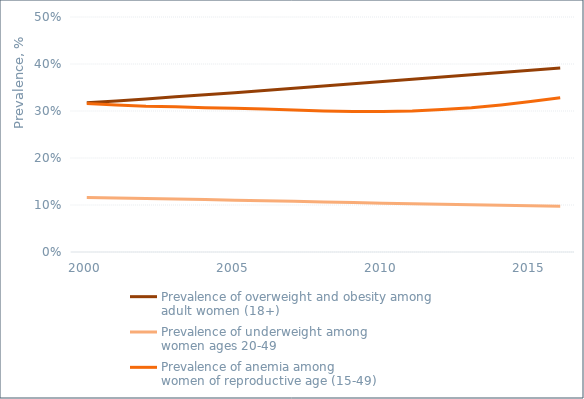
| Category | Prevalence of overweight and obesity among 
adult women (18+) | Prevalence of underweight among 
women ages 20-49 | Prevalence of anemia among 
women of reproductive age (15-49) |
|---|---|---|---|
| 2000.0 | 0.317 | 0.116 | 0.316 |
| 2001.0 | 0.322 | 0.115 | 0.313 |
| 2002.0 | 0.326 | 0.114 | 0.31 |
| 2003.0 | 0.33 | 0.113 | 0.309 |
| 2004.0 | 0.335 | 0.111 | 0.307 |
| 2005.0 | 0.339 | 0.11 | 0.306 |
| 2006.0 | 0.344 | 0.109 | 0.304 |
| 2007.0 | 0.348 | 0.108 | 0.302 |
| 2008.0 | 0.353 | 0.106 | 0.3 |
| 2009.0 | 0.358 | 0.105 | 0.299 |
| 2010.0 | 0.363 | 0.104 | 0.299 |
| 2011.0 | 0.367 | 0.103 | 0.3 |
| 2012.0 | 0.372 | 0.102 | 0.303 |
| 2013.0 | 0.377 | 0.101 | 0.307 |
| 2014.0 | 0.382 | 0.1 | 0.313 |
| 2015.0 | 0.387 | 0.098 | 0.32 |
| 2016.0 | 0.392 | 0.097 | 0.328 |